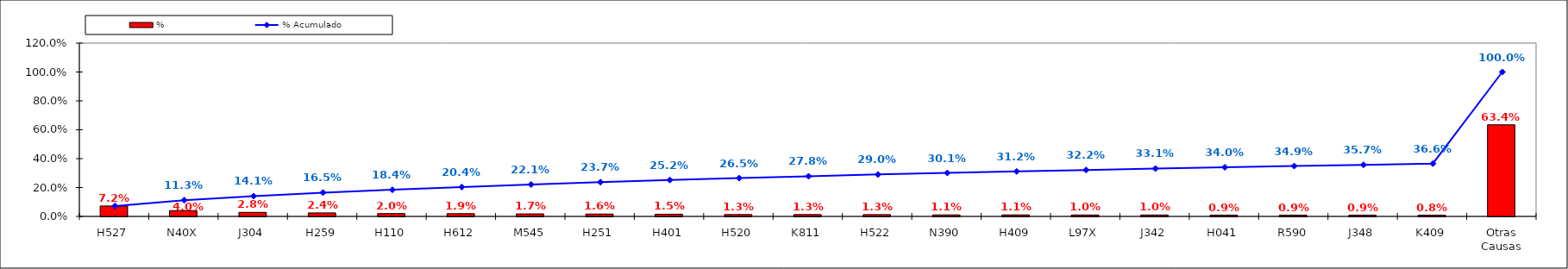
| Category | % |
|---|---|
| H527 | 0.072 |
| N40X | 0.04 |
| J304 | 0.028 |
| H259 | 0.024 |
| H110 | 0.02 |
| H612 | 0.019 |
| M545 | 0.017 |
| H251 | 0.016 |
| H401 | 0.015 |
| H520 | 0.013 |
| K811 | 0.013 |
| H522 | 0.013 |
| N390 | 0.011 |
| H409 | 0.011 |
| L97X | 0.01 |
| J342 | 0.01 |
| H041 | 0.009 |
| R590 | 0.009 |
| J348 | 0.009 |
| K409 | 0.008 |
| Otras Causas | 0.634 |